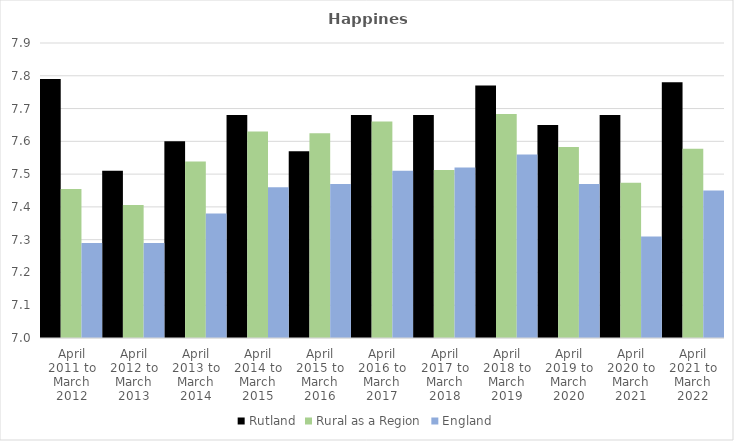
| Category | Rutland | Rural as a Region | England |
|---|---|---|---|
| April 2011 to March 2012 | 7.79 | 7.454 | 7.29 |
| April 2012 to March 2013 | 7.51 | 7.406 | 7.29 |
| April 2013 to March 2014 | 7.6 | 7.539 | 7.38 |
| April 2014 to March 2015 | 7.68 | 7.63 | 7.46 |
| April 2015 to March 2016 | 7.57 | 7.625 | 7.47 |
| April 2016 to March 2017 | 7.68 | 7.661 | 7.51 |
| April 2017 to March 2018 | 7.68 | 7.513 | 7.52 |
| April 2018 to March 2019 | 7.77 | 7.684 | 7.56 |
| April 2019 to March 2020 | 7.65 | 7.582 | 7.47 |
| April 2020 to March 2021 | 7.68 | 7.474 | 7.31 |
| April 2021 to March 2022 | 7.78 | 7.577 | 7.45 |